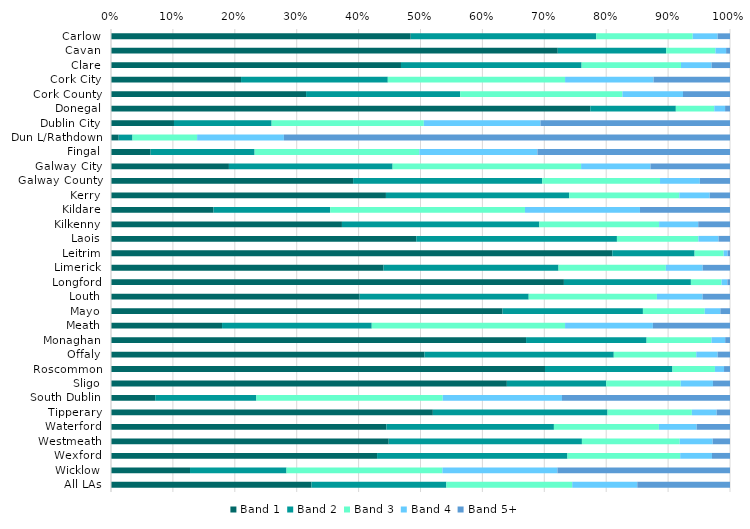
| Category | Band 1 | Band 2 | Band 3 | Band 4 | Band 5+ |
|---|---|---|---|---|---|
| Carlow | 0.484 | 0.3 | 0.156 | 0.04 | 0.02 |
| Cavan | 0.722 | 0.175 | 0.08 | 0.017 | 0.006 |
| Clare | 0.468 | 0.292 | 0.161 | 0.049 | 0.03 |
| Cork City | 0.21 | 0.237 | 0.286 | 0.143 | 0.123 |
| Cork County | 0.315 | 0.249 | 0.262 | 0.098 | 0.076 |
| Donegal | 0.774 | 0.138 | 0.062 | 0.017 | 0.008 |
| Dublin City | 0.102 | 0.158 | 0.246 | 0.189 | 0.306 |
| Dun L/Rathdown | 0.012 | 0.022 | 0.104 | 0.14 | 0.721 |
| Fingal | 0.064 | 0.168 | 0.266 | 0.191 | 0.311 |
| Galway City | 0.191 | 0.264 | 0.305 | 0.112 | 0.128 |
| Galway County | 0.391 | 0.306 | 0.19 | 0.064 | 0.049 |
| Kerry | 0.444 | 0.296 | 0.178 | 0.049 | 0.033 |
| Kildare | 0.166 | 0.189 | 0.315 | 0.186 | 0.145 |
| Kilkenny | 0.373 | 0.319 | 0.194 | 0.063 | 0.051 |
| Laois | 0.493 | 0.324 | 0.132 | 0.033 | 0.019 |
| Leitrim | 0.81 | 0.133 | 0.047 | 0.007 | 0.004 |
| Limerick | 0.44 | 0.283 | 0.173 | 0.059 | 0.044 |
| Longford | 0.732 | 0.205 | 0.05 | 0.009 | 0.004 |
| Louth | 0.402 | 0.273 | 0.207 | 0.074 | 0.044 |
| Mayo | 0.633 | 0.227 | 0.1 | 0.025 | 0.016 |
| Meath | 0.179 | 0.242 | 0.312 | 0.142 | 0.125 |
| Monaghan | 0.671 | 0.195 | 0.105 | 0.022 | 0.008 |
| Offaly | 0.506 | 0.306 | 0.133 | 0.035 | 0.02 |
| Roscommon | 0.701 | 0.206 | 0.069 | 0.015 | 0.01 |
| Sligo | 0.64 | 0.16 | 0.12 | 0.052 | 0.028 |
| South Dublin | 0.071 | 0.163 | 0.301 | 0.193 | 0.271 |
| Tipperary | 0.52 | 0.282 | 0.136 | 0.04 | 0.022 |
| Waterford | 0.445 | 0.271 | 0.17 | 0.061 | 0.054 |
| Westmeath | 0.449 | 0.312 | 0.158 | 0.053 | 0.028 |
| Wexford | 0.43 | 0.308 | 0.182 | 0.051 | 0.029 |
| Wicklow | 0.128 | 0.156 | 0.252 | 0.186 | 0.279 |
| All LAs | 0.324 | 0.218 | 0.203 | 0.105 | 0.15 |